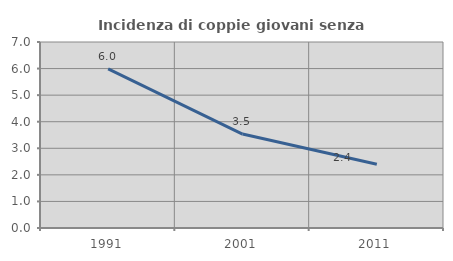
| Category | Incidenza di coppie giovani senza figli |
|---|---|
| 1991.0 | 5.986 |
| 2001.0 | 3.536 |
| 2011.0 | 2.397 |